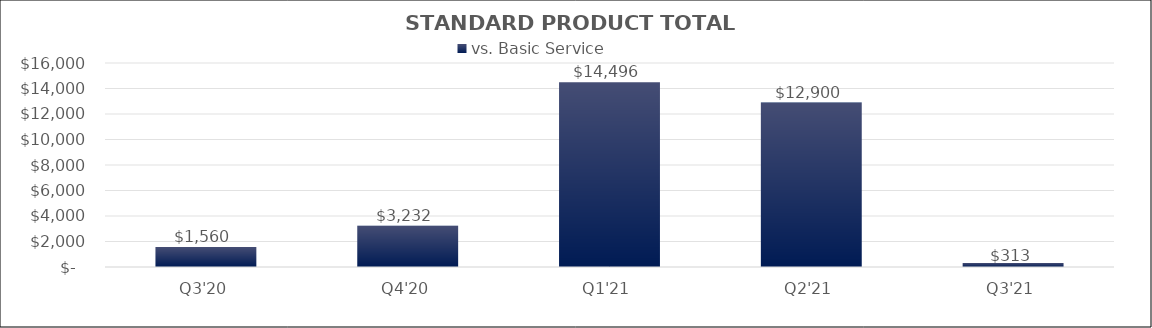
| Category | vs. Basic Service |
|---|---|
| Q3'20 | 1559.515 |
| Q4'20 | 3232.172 |
| Q1'21 | 14495.651 |
| Q2'21 | 12900.209 |
| Q3'21 | 312.535 |